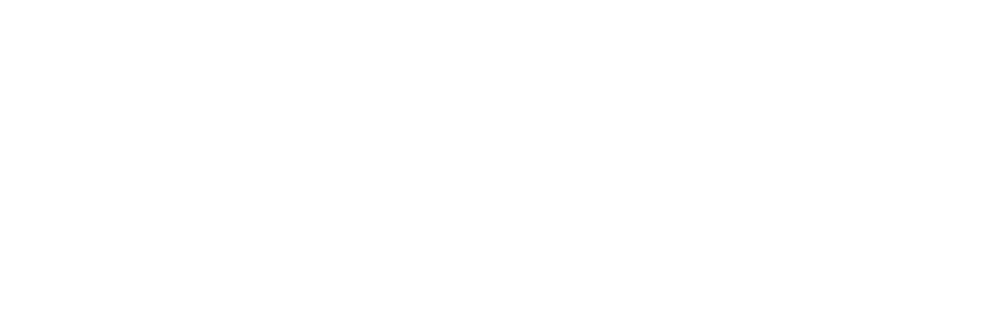
| Category | Total |
|---|---|
| 0 | 0.127 |
| 1 | 0.291 |
| 2 | 0.262 |
| 3 | 0.185 |
| 4 | 0.135 |